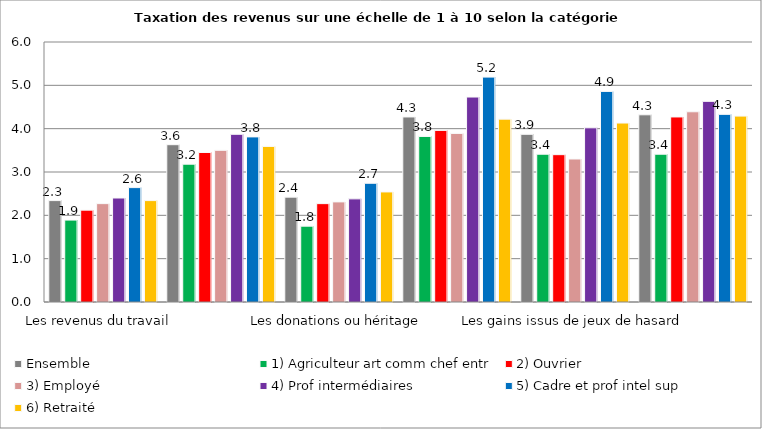
| Category | Ensemble | 1) Agriculteur art comm chef entr | 2) Ouvrier | 3) Employé | 4) Prof intermédiaires | 5) Cadre et prof intel sup | 6) Retraité |
|---|---|---|---|---|---|---|---|
| Les revenus du travail  | 2.34 | 1.89 | 2.12 | 2.27 | 2.4 | 2.64 | 2.34 |
| Les revenus et les plus-values issus de l’immobilier | 3.63 | 3.18 | 3.45 | 3.5 | 3.87 | 3.81 | 3.59 |
| Les donations ou héritage | 2.42 | 1.75 | 2.27 | 2.31 | 2.38 | 2.74 | 2.54 |
| Les revenus issus de revenus de placements financiers | 4.27 | 3.82 | 3.96 | 3.89 | 4.73 | 5.19 | 4.22 |
| Les gains issus de jeux de hasard | 3.87 | 3.41 | 3.4 | 3.3 | 4.02 | 4.86 | 4.13 |
| Les plus-values sur une entreprise créée et revendue | 4.32 | 3.41 | 4.27 | 4.39 | 4.63 | 4.33 | 4.29 |